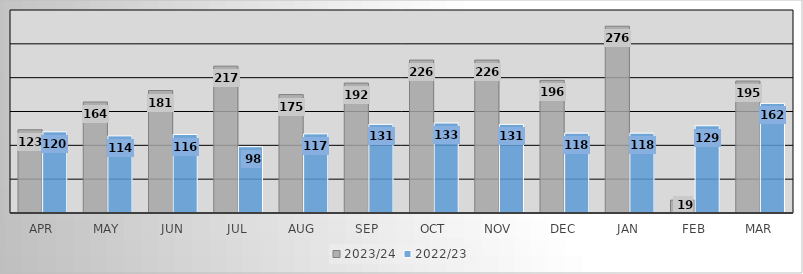
| Category | 2023/24 | 2022/23 |
|---|---|---|
| Apr | 123 | 120 |
| May | 164 | 114 |
| Jun | 181 | 116 |
| Jul | 217 | 98 |
| Aug | 175 | 117 |
| Sep | 192 | 131 |
| Oct | 226 | 133 |
| Nov | 226 | 131 |
| Dec | 196 | 118 |
| Jan | 276 | 118 |
| Feb | 19 | 129 |
| Mar | 195 | 162 |